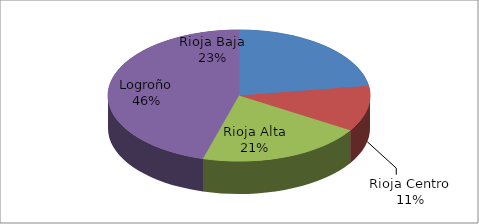
| Category | Series 0 |
|---|---|
| Rioja Baja | 1161 |
| Rioja Centro | 577 |
| Rioja Alta | 1054 |
| Logroño | 2338 |